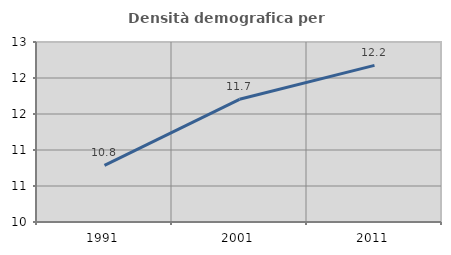
| Category | Densità demografica |
|---|---|
| 1991.0 | 10.786 |
| 2001.0 | 11.704 |
| 2011.0 | 12.175 |